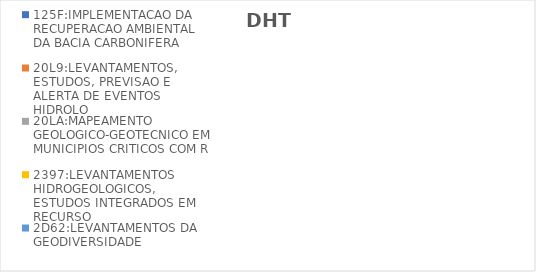
| Category | 125F:IMPLEMENTACAO DA RECUPERACAO AMBIENTAL DA BACIA CARBONIFERA | 20L9:LEVANTAMENTOS, ESTUDOS, PREVISAO E ALERTA DE EVENTOS HIDROLO | 20LA:MAPEAMENTO GEOLOGICO-GEOTECNICO EM MUNICIPIOS CRITICOS COM R | 2397:LEVANTAMENTOS HIDROGEOLOGICOS, ESTUDOS INTEGRADOS EM RECURSO | 2D62:LEVANTAMENTOS DA GEODIVERSIDADE |
|---|---|---|---|---|---|
| EXECUTADO | 0.045 | 0.183 | 0.188 | 0.165 | 0.304 |